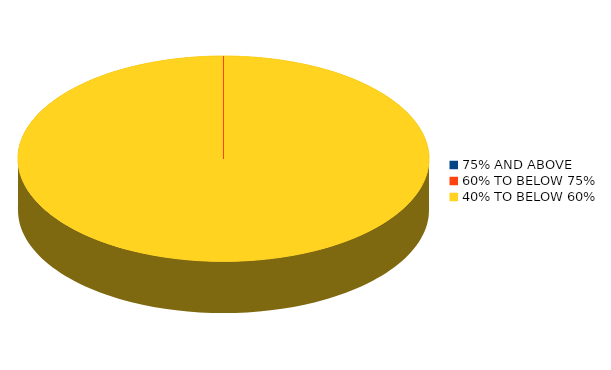
| Category | Number of students |
|---|---|
| 75% AND ABOVE | 0 |
| 60% TO BELOW 75% | 0 |
| 40% TO BELOW 60% | 5 |